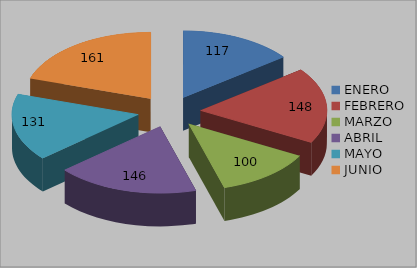
| Category | Series 0 |
|---|---|
| ENERO | 117 |
| FEBRERO | 148 |
| MARZO | 100 |
| ABRIL | 146 |
| MAYO | 131 |
| JUNIO | 161 |